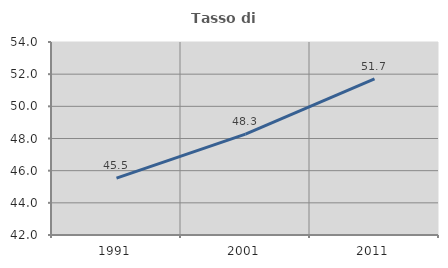
| Category | Tasso di occupazione   |
|---|---|
| 1991.0 | 45.54 |
| 2001.0 | 48.275 |
| 2011.0 | 51.702 |